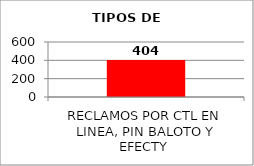
| Category | RECLAMOS POR CTL EN LINEA, PIN BALOTO Y EFECTY  |
|---|---|
| RECLAMOS POR CTL EN LINEA, PIN BALOTO Y EFECTY  | 404 |